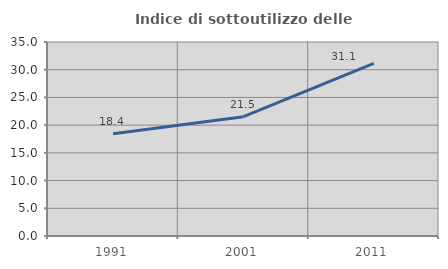
| Category | Indice di sottoutilizzo delle abitazioni  |
|---|---|
| 1991.0 | 18.435 |
| 2001.0 | 21.519 |
| 2011.0 | 31.132 |